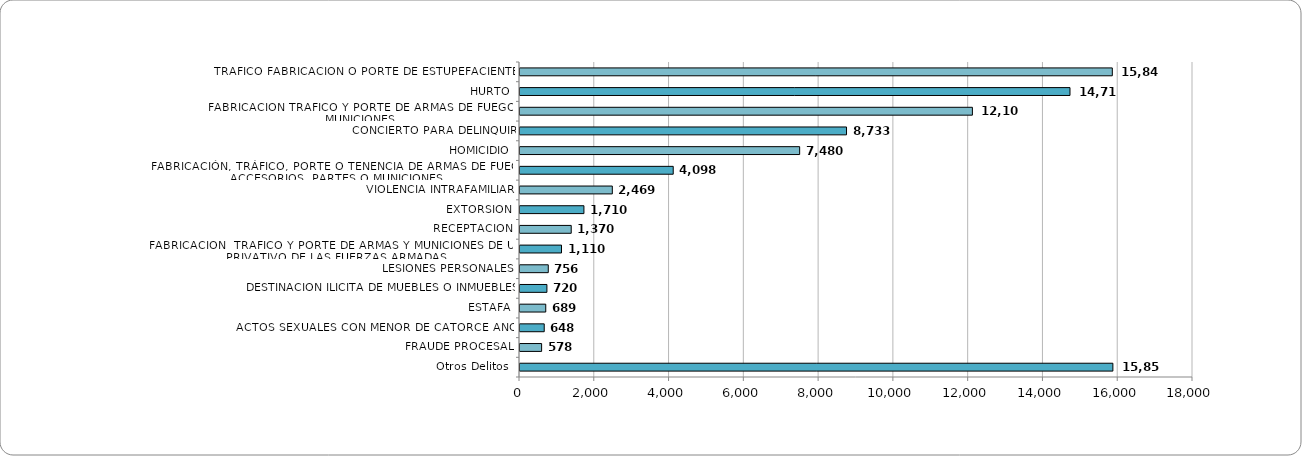
| Category | Series 0 |
|---|---|
| TRAFICO FABRICACION O PORTE DE ESTUPEFACIENTES | 15842 |
| HURTO | 14710 |
| FABRICACION TRAFICO Y PORTE DE ARMAS DE FUEGO O MUNICIONES | 12100 |
| CONCIERTO PARA DELINQUIR | 8733 |
| HOMICIDIO | 7480 |
| FABRICACIÓN, TRÁFICO, PORTE O TENENCIA DE ARMAS DE FUEGO, ACCESORIOS, PARTES O MUNICIONES | 4098 |
| VIOLENCIA INTRAFAMILIAR | 2469 |
| EXTORSION | 1710 |
| RECEPTACION | 1370 |
| FABRICACION  TRAFICO Y PORTE DE ARMAS Y MUNICIONES DE USO PRIVATIVO DE LAS FUERZAS ARMADAS | 1110 |
| LESIONES PERSONALES | 756 |
| DESTINACION ILICITA DE MUEBLES O INMUEBLES | 720 |
| ESTAFA | 689 |
| ACTOS SEXUALES CON MENOR DE CATORCE AÑOS | 648 |
| FRAUDE PROCESAL | 578 |
| Otros Delitos  | 15857 |